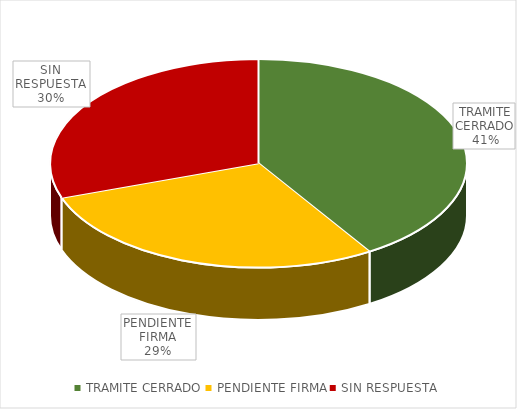
| Category | CANT |
|---|---|
| TRAMITE CERRADO | 23 |
| PENDIENTE FIRMA | 16 |
| SIN RESPUESTA | 17 |